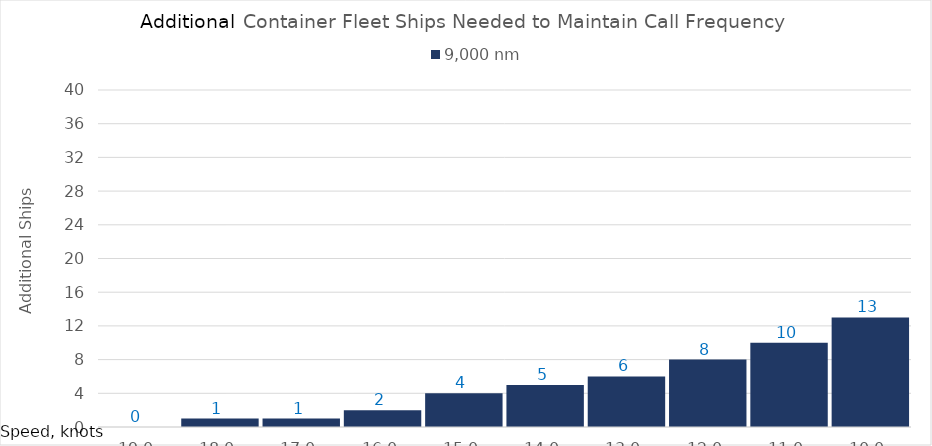
| Category | 9,000 |
|---|---|
| 19.0 | 0 |
| 18.0 | 1 |
| 17.0 | 1 |
| 16.0 | 2 |
| 15.0 | 4 |
| 14.0 | 5 |
| 13.0 | 6 |
| 12.0 | 8 |
| 11.0 | 10 |
| 10.0 | 13 |